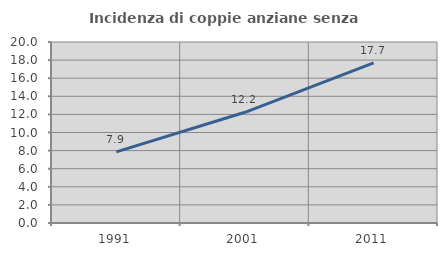
| Category | Incidenza di coppie anziane senza figli  |
|---|---|
| 1991.0 | 7.865 |
| 2001.0 | 12.234 |
| 2011.0 | 17.703 |